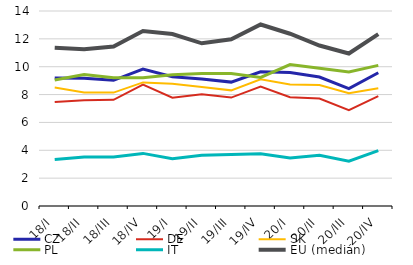
| Category | CZ | DE | SK | PL | IT | EU (medián) |
|---|---|---|---|---|---|---|
| 18/I | 9.197 | 7.46 | 8.501 | 9.042 | 3.337 | 11.366 |
| 18/II | 9.163 | 7.591 | 8.148 | 9.443 | 3.524 | 11.26 |
| 18/III | 9.022 | 7.621 | 8.142 | 9.206 | 3.52 | 11.454 |
| 18/IV | 9.837 | 8.719 | 8.874 | 9.212 | 3.777 | 12.561 |
| 19/I | 9.276 | 7.776 | 8.774 | 9.422 | 3.388 | 12.343 |
| 19/II | 9.12 | 8.028 | 8.546 | 9.505 | 3.644 | 11.682 |
| 19/III | 8.894 | 7.783 | 8.302 | 9.514 | 3.698 | 11.969 |
| 19/IV | 9.633 | 8.572 | 9.099 | 9.232 | 3.754 | 13.032 |
| 20/I | 9.58 | 7.807 | 8.724 | 10.15 | 3.441 | 12.367 |
| 20/II | 9.261 | 7.716 | 8.688 | 9.885 | 3.638 | 11.522 |
| 20/III | 8.423 | 6.884 | 8.099 | 9.625 | 3.214 | 10.948 |
| 20/IV | 9.564 | 7.886 | 8.446 | 10.099 | 3.976 | 12.339 |